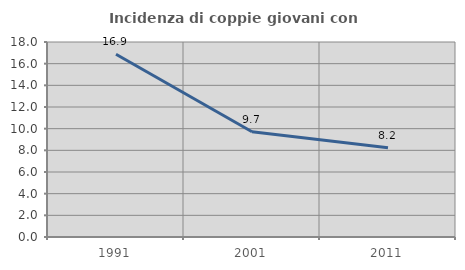
| Category | Incidenza di coppie giovani con figli |
|---|---|
| 1991.0 | 16.863 |
| 2001.0 | 9.717 |
| 2011.0 | 8.246 |